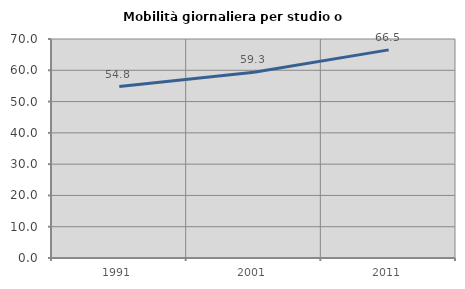
| Category | Mobilità giornaliera per studio o lavoro |
|---|---|
| 1991.0 | 54.784 |
| 2001.0 | 59.349 |
| 2011.0 | 66.52 |